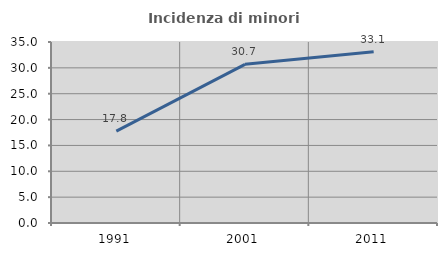
| Category | Incidenza di minori stranieri |
|---|---|
| 1991.0 | 17.778 |
| 2001.0 | 30.682 |
| 2011.0 | 33.123 |